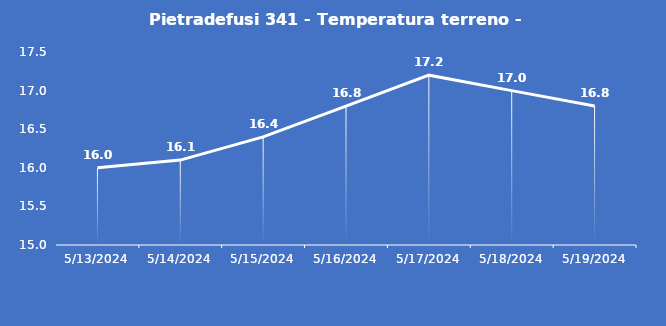
| Category | Pietradefusi 341 - Temperatura terreno - Grezzo (°C) |
|---|---|
| 5/13/24 | 16 |
| 5/14/24 | 16.1 |
| 5/15/24 | 16.4 |
| 5/16/24 | 16.8 |
| 5/17/24 | 17.2 |
| 5/18/24 | 17 |
| 5/19/24 | 16.8 |